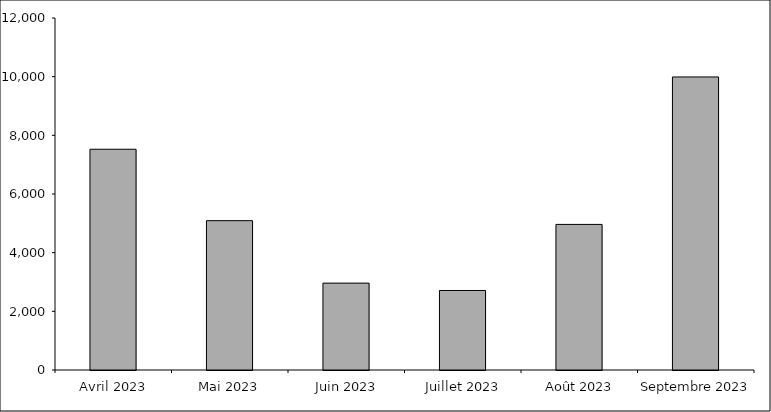
| Category | Series 0 |
|---|---|
| Avril 2023 | 7526 |
| Mai 2023 | 5091 |
| Juin 2023 | 2962 |
| Juillet 2023 | 2711 |
| Août 2023 | 4963 |
| Septembre 2023 | 9990 |